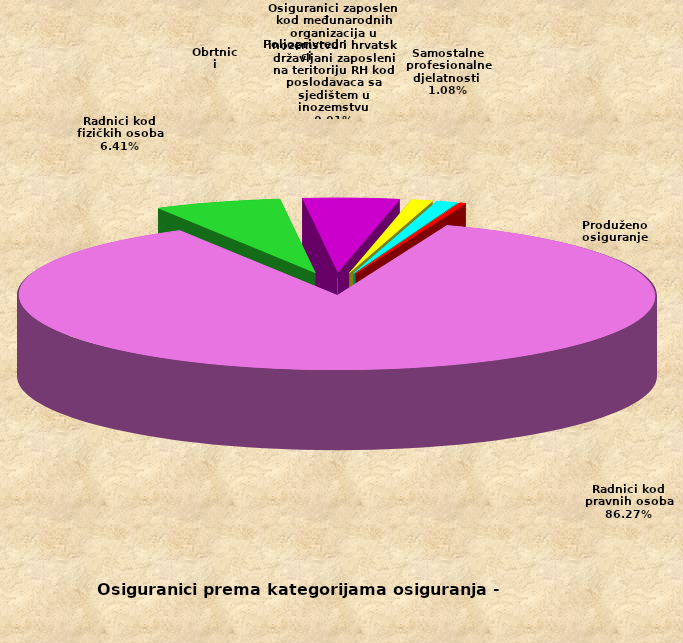
| Category | Series 0 |
|---|---|
| Radnici kod pravnih osoba | 1459292 |
| Radnici kod fizičkih osoba | 108499 |
| Obrtnici | 82307 |
| Poljoprivrednici | 18133 |
| Samostalne profesionalne djelatnosti  | 18238 |
| Osiguranici zaposleni kod međunarodnih organizacija u inozemstvu i hrvatski državljani zaposleni na teritoriju RH kod poslodavaca sa sjedištem u inozemstvu | 184 |
| Produženo osiguranje | 4913 |